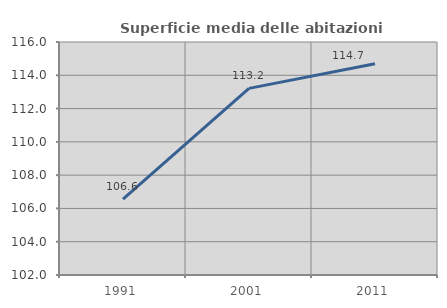
| Category | Superficie media delle abitazioni occupate |
|---|---|
| 1991.0 | 106.553 |
| 2001.0 | 113.213 |
| 2011.0 | 114.697 |